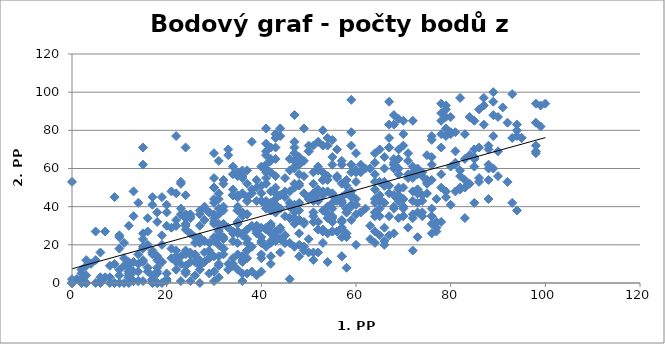
| Category | 2.PP |
|---|---|
| 43.0 | 65 |
| 37.0 | 43 |
| 27.0 | 7 |
| 33.0 | 70 |
| 41.0 | 19 |
| 55.0 | 34 |
| 82.0 | 50 |
| 48.0 | 52 |
| 19.0 | 11 |
| 68.0 | 88 |
| 8.0 | 3 |
| 24.0 | 16 |
| 48.0 | 57 |
| 74.0 | 37 |
| 50.0 | 72 |
| 58.0 | 24 |
| 61.0 | 37 |
| 57.0 | 14 |
| 62.0 | 60 |
| 43.0 | 41 |
| 54.0 | 40 |
| 48.0 | 66 |
| 40.0 | 13 |
| 35.0 | 38 |
| 76.0 | 75 |
| 66.0 | 20 |
| 69.0 | 86 |
| 21.0 | 29 |
| 90.0 | 69 |
| 73.0 | 42 |
| 87.0 | 93 |
| 23.0 | 14 |
| 68.0 | 60 |
| 11.0 | 9 |
| 46.0 | 2 |
| 42.0 | 38 |
| 54.0 | 34 |
| 48.0 | 33 |
| 88.0 | 72 |
| 17.0 | 41 |
| 30.0 | 36 |
| 72.0 | 85 |
| 55.0 | 27 |
| 2.0 | 0 |
| 2.0 | 5 |
| 48.0 | 33 |
| 76.0 | 31 |
| 41.0 | 69 |
| 85.0 | 85 |
| 42.0 | 39 |
| 74.0 | 43 |
| 54.0 | 48 |
| 72.0 | 17 |
| 31.0 | 27 |
| 50.0 | 69 |
| 89.0 | 60 |
| 20.0 | 2 |
| 10.0 | 24 |
| 84.0 | 87 |
| 91.0 | 92 |
| 76.0 | 35 |
| 53.0 | 72 |
| 37.0 | 43 |
| 35.0 | 46 |
| 47.0 | 52 |
| 28.0 | 39 |
| 35.0 | 27 |
| 76.0 | 62 |
| 8.0 | 0 |
| 19.0 | 25 |
| 68.0 | 40 |
| 58.0 | 47 |
| 28.0 | 33 |
| 27.0 | 30 |
| 84.0 | 67 |
| 40.0 | 29 |
| 26.0 | 15 |
| 79.0 | 81 |
| 78.0 | 89 |
| 42.0 | 64 |
| 73.0 | 49 |
| 66.0 | 53 |
| 25.0 | 11 |
| 9.0 | 45 |
| 24.0 | 17 |
| 95.0 | 76 |
| 52.0 | 47 |
| 14.0 | 15 |
| 30.0 | 1 |
| 18.0 | 5 |
| 58.0 | 51 |
| 42.0 | 71 |
| 0.0 | 0 |
| 42.0 | 26 |
| 89.0 | 95 |
| 26.0 | 15 |
| 70.0 | 85 |
| 19.0 | 11 |
| 34.0 | 49 |
| 53.0 | 54 |
| 42.0 | 30 |
| 63.0 | 60 |
| 54.0 | 36 |
| 5.0 | 27 |
| 98.0 | 68 |
| 86.0 | 91 |
| 49.0 | 19 |
| 52.0 | 49 |
| 42.0 | 38 |
| 24.0 | 15 |
| 5.0 | 0 |
| 79.0 | 93 |
| 65.0 | 46 |
| 30.0 | 22 |
| 35.0 | 58 |
| 34.0 | 10 |
| 21.0 | 18 |
| 69.0 | 60 |
| 82.0 | 59 |
| 70.0 | 50 |
| 86.0 | 53 |
| 67.0 | 71 |
| 71.0 | 55 |
| 88.0 | 62 |
| 31.0 | 3 |
| 29.0 | 13 |
| 15.0 | 1 |
| 26.0 | 21 |
| 20.0 | 1 |
| 31.0 | 24 |
| 43.0 | 76 |
| 24.0 | 46 |
| 53.0 | 27 |
| 36.0 | 1 |
| 35.0 | 27 |
| 78.0 | 78 |
| 55.0 | 75 |
| 25.0 | 1 |
| 17.0 | 1 |
| 41.0 | 59 |
| 81.0 | 79 |
| 0.0 | 53 |
| 55.0 | 27 |
| 59.0 | 40 |
| 68.0 | 46 |
| 37.0 | 5 |
| 64.0 | 63 |
| 41.0 | 67 |
| 37.0 | 45 |
| 17.0 | 17 |
| 65.0 | 39 |
| 48.0 | 42 |
| 59.0 | 33 |
| 29.0 | 16 |
| 43.0 | 37 |
| 67.0 | 47 |
| 30.0 | 14 |
| 47.0 | 38 |
| 30.0 | 55 |
| 32.0 | 38 |
| 21.0 | 13 |
| 94.0 | 83 |
| 74.0 | 58 |
| 37.0 | 17 |
| 48.0 | 20 |
| 51.0 | 47 |
| 31.0 | 10 |
| 57.0 | 29 |
| 37.0 | 13 |
| 30.0 | 44 |
| 71.0 | 29 |
| 43.0 | 27 |
| 35.0 | 45 |
| 7.0 | 3 |
| 36.0 | 25 |
| 41.0 | 39 |
| 24.0 | 31 |
| 51.0 | 16 |
| 79.0 | 77 |
| 55.0 | 35 |
| 47.0 | 71 |
| 39.0 | 30 |
| 2.0 | 2 |
| 68.0 | 63 |
| 32.0 | 18 |
| 29.0 | 17 |
| 6.0 | 3 |
| 57.0 | 33 |
| 32.0 | 31 |
| 47.0 | 34 |
| 11.0 | 21 |
| 3.0 | 0 |
| 31.0 | 39 |
| 31.0 | 64 |
| 86.0 | 55 |
| 17.0 | 2 |
| 53.0 | 80 |
| 42.0 | 58 |
| 19.0 | 45 |
| 65.0 | 70 |
| 90.0 | 87 |
| 60.0 | 68 |
| 10.0 | 18 |
| 37.0 | 23 |
| 50.0 | 45 |
| 32.0 | 18 |
| 32.0 | 24 |
| 12.0 | 0 |
| 81.0 | 48 |
| 12.0 | 3 |
| 47.0 | 61 |
| 73.0 | 47 |
| 12.0 | 10 |
| 60.0 | 36 |
| 64.0 | 37 |
| 66.0 | 29 |
| 47.0 | 37 |
| 10.0 | 7 |
| 88.0 | 60 |
| 51.0 | 43 |
| 6.0 | 1 |
| 45.0 | 48 |
| 99.0 | 82 |
| 67.0 | 35 |
| 22.0 | 14 |
| 88.0 | 54 |
| 50.0 | 69 |
| 28.0 | 16 |
| 41.0 | 52 |
| 57.0 | 64 |
| 58.0 | 37 |
| 83.0 | 50 |
| 78.0 | 85 |
| 30.0 | 50 |
| 29.0 | 37 |
| 34.0 | 22 |
| 16.0 | 20 |
| 15.0 | 26 |
| 37.0 | 36 |
| 65.0 | 25 |
| 61.0 | 62 |
| 35.0 | 40 |
| 51.0 | 72 |
| 15.0 | 19 |
| 63.0 | 23 |
| 2.0 | 1 |
| 12.0 | 3 |
| 25.0 | 26 |
| 6.0 | 0 |
| 36.0 | 12 |
| 11.0 | 0 |
| 88.0 | 44 |
| 35.0 | 45 |
| 51.0 | 12 |
| 26.0 | 4 |
| 0.0 | 0 |
| 17.0 | 15 |
| 41.0 | 39 |
| 54.0 | 72 |
| 74.0 | 56 |
| 15.0 | 18 |
| 38.0 | 6 |
| 65.0 | 53 |
| 25.0 | 15 |
| 36.0 | 26 |
| 13.0 | 35 |
| 45.0 | 45 |
| 55.0 | 62 |
| 27.0 | 12 |
| 51.0 | 45 |
| 68.0 | 83 |
| 46.0 | 21 |
| 51.0 | 32 |
| 0.0 | 2 |
| 73.0 | 60 |
| 12.0 | 10 |
| 72.0 | 61 |
| 43.0 | 23 |
| 12.0 | 6 |
| 77.0 | 29 |
| 29.0 | 37 |
| 30.0 | 24 |
| 27.0 | 0 |
| 31.0 | 47 |
| 48.0 | 26 |
| 42.0 | 14 |
| 43.0 | 71 |
| 68.0 | 65 |
| 43.0 | 78 |
| 17.0 | 45 |
| 34.0 | 46 |
| 24.0 | 6 |
| 76.0 | 39 |
| 30.0 | 68 |
| 15.0 | 11 |
| 27.0 | 9 |
| 38.0 | 19 |
| 73.0 | 49 |
| 57.0 | 45 |
| 36.0 | 55 |
| 66.0 | 22 |
| 59.0 | 46 |
| 69.0 | 46 |
| 17.0 | 0 |
| 25.0 | 36 |
| 70.0 | 44 |
| 46.0 | 34 |
| 30.0 | 34 |
| 48.0 | 33 |
| 31.0 | 14 |
| 20.0 | 30 |
| 42.0 | 65 |
| 88.0 | 70 |
| 59.0 | 41 |
| 12.0 | 30 |
| 46.0 | 34 |
| 22.0 | 14 |
| 49.0 | 32 |
| 42.0 | 10 |
| 22.0 | 13 |
| 31.0 | 9 |
| 53.0 | 38 |
| 69.0 | 43 |
| 18.0 | 14 |
| 18.0 | 6 |
| 44.0 | 39 |
| 75.0 | 53 |
| 35.0 | 7 |
| 41.0 | 58 |
| 44.0 | 16 |
| 35.0 | 31 |
| 44.0 | 29 |
| 62.0 | 39 |
| 76.0 | 54 |
| 57.0 | 24 |
| 48.0 | 14 |
| 69.0 | 57 |
| 60.0 | 58 |
| 53.0 | 46 |
| 42.0 | 48 |
| 24.0 | 9 |
| 73.0 | 37 |
| 50.0 | 23 |
| 27.0 | 36 |
| 93.0 | 42 |
| 71.0 | 57 |
| 43.0 | 47 |
| 3.0 | 9 |
| 40.0 | 43 |
| 69.0 | 49 |
| 41.0 | 41 |
| 78.0 | 71 |
| 72.0 | 36 |
| 36.0 | 35 |
| 39.0 | 50 |
| 11.0 | 13 |
| 46.0 | 42 |
| 38.0 | 74 |
| 56.0 | 43 |
| 10.0 | 25 |
| 18.0 | 12 |
| 29.0 | 21 |
| 78.0 | 57 |
| 51.0 | 58 |
| 28.0 | 11 |
| 16.0 | 6 |
| 72.0 | 55 |
| 43.0 | 27 |
| 61.0 | 37 |
| 54.0 | 40 |
| 73.0 | 57 |
| 84.0 | 52 |
| 56.0 | 56 |
| 22.0 | 11 |
| 34.0 | 46 |
| 55.0 | 39 |
| 17.0 | 2 |
| 15.0 | 71 |
| 67.0 | 25 |
| 54.0 | 26 |
| 38.0 | 47 |
| 20.0 | 37 |
| 33.0 | 10 |
| 85.0 | 65 |
| 87.0 | 83 |
| 43.0 | 22 |
| 37.0 | 17 |
| 93.0 | 99 |
| 41.0 | 73 |
| 73.0 | 59 |
| 39.0 | 54 |
| 75.0 | 47 |
| 60.0 | 59 |
| 56.0 | 44 |
| 49.0 | 47 |
| 46.0 | 40 |
| 14.0 | 1 |
| 67.0 | 76 |
| 9.0 | 0 |
| 37.0 | 36 |
| 32.0 | 15 |
| 13.0 | 1 |
| 12.0 | 4 |
| 77.0 | 44 |
| 56.0 | 70 |
| 3.0 | 4 |
| 24.0 | 34 |
| 36.0 | 58 |
| 40.0 | 6 |
| 89.0 | 77 |
| 55.0 | 66 |
| 77.0 | 32 |
| 72.0 | 58 |
| 49.0 | 81 |
| 90.0 | 56 |
| 52.0 | 16 |
| 44.0 | 81 |
| 34.0 | 57 |
| 41.0 | 62 |
| 20.0 | 5 |
| 16.0 | 34 |
| 54.0 | 56 |
| 12.0 | 11 |
| 54.0 | 54 |
| 23.0 | 1 |
| 6.0 | 16 |
| 67.0 | 95 |
| 73.0 | 47 |
| 80.0 | 79 |
| 22.0 | 77 |
| 76.0 | 35 |
| 22.0 | 12 |
| 36.0 | 14 |
| 44.0 | 23 |
| 36.0 | 47 |
| 40.0 | 21 |
| 77.0 | 27 |
| 18.0 | 0 |
| 43.0 | 37 |
| 35.0 | 38 |
| 52.0 | 59 |
| 78.0 | 94 |
| 12.0 | 5 |
| 55.0 | 47 |
| 72.0 | 34 |
| 48.0 | 51 |
| 14.0 | 42 |
| 57.0 | 52 |
| 70.0 | 40 |
| 47.0 | 19 |
| 25.0 | 35 |
| 80.0 | 41 |
| 98.0 | 72 |
| 70.0 | 40 |
| 32.0 | 40 |
| 22.0 | 17 |
| 46.0 | 48 |
| 32.0 | 23 |
| 42.0 | 38 |
| 33.0 | 67 |
| 32.0 | 54 |
| 15.0 | 62 |
| 37.0 | 59 |
| 100.0 | 94 |
| 39.0 | 43 |
| 89.0 | 100 |
| 58.0 | 26 |
| 69.0 | 65 |
| 36.0 | 14 |
| 82.0 | 56 |
| 53.0 | 21 |
| 58.0 | 39 |
| 22.0 | 33 |
| 47.0 | 88 |
| 56.0 | 27 |
| 71.0 | 68 |
| 8.0 | 9 |
| 49.0 | 31 |
| 51.0 | 37 |
| 64.0 | 42 |
| 22.0 | 30 |
| 35.0 | 15 |
| 3.0 | 0 |
| 46.0 | 40 |
| 47.0 | 50 |
| 57.0 | 14 |
| 48.0 | 38 |
| 68.0 | 46 |
| 63.0 | 30 |
| 66.0 | 60 |
| 26.0 | 24 |
| 70.0 | 35 |
| 68.0 | 62 |
| 81.0 | 62 |
| 31.0 | 28 |
| 23.0 | 36 |
| 22.0 | 47 |
| 43.0 | 50 |
| 59.0 | 62 |
| 39.0 | 28 |
| 70.0 | 39 |
| 78.0 | 50 |
| 60.0 | 44 |
| 94.0 | 80 |
| 54.0 | 76 |
| 43.0 | 44 |
| 19.0 | 0 |
| 24.0 | 6 |
| 18.0 | 8 |
| 25.0 | 26 |
| 45.0 | 25 |
| 35.0 | 26 |
| 43.0 | 25 |
| 98.0 | 84 |
| 37.0 | 28 |
| 68.0 | 62 |
| 36.0 | 11 |
| 58.0 | 54 |
| 18.0 | 14 |
| 59.0 | 79 |
| 39.0 | 4 |
| 29.0 | 5 |
| 81.0 | 63 |
| 4.0 | 10 |
| 70.0 | 72 |
| 7.0 | 27 |
| 34.0 | 61 |
| 55.0 | 32 |
| 64.0 | 37 |
| 42.0 | 38 |
| 75.0 | 54 |
| 41.0 | 60 |
| 25.0 | 34 |
| 44.0 | 39 |
| 28.0 | 22 |
| 49.0 | 19 |
| 76.0 | 66 |
| 72.0 | 43 |
| 59.0 | 96 |
| 60.0 | 20 |
| 92.0 | 84 |
| 0.0 | 0 |
| 13.0 | 6 |
| 16.0 | 8 |
| 52.0 | 61 |
| 47.0 | 31 |
| 57.0 | 62 |
| 40.0 | 43 |
| 53.0 | 28 |
| 39.0 | 26 |
| 48.0 | 62 |
| 32.0 | 52 |
| 85.0 | 66 |
| 60.0 | 53 |
| 24.0 | 5 |
| 75.0 | 67 |
| 86.0 | 71 |
| 24.0 | 30 |
| 52.0 | 43 |
| 15.0 | 12 |
| 40.0 | 51 |
| 27.0 | 38 |
| 49.0 | 64 |
| 1.0 | 2 |
| 85.0 | 70 |
| 33.0 | 7 |
| 69.0 | 50 |
| 18.0 | 0 |
| 53.0 | 58 |
| 19.0 | 20 |
| 30.0 | 32 |
| 92.0 | 53 |
| 57.0 | 42 |
| 53.0 | 54 |
| 74.0 | 35 |
| 79.0 | 45 |
| 47.0 | 74 |
| 34.0 | 26 |
| 93.0 | 76 |
| 24.0 | 36 |
| 87.0 | 97 |
| 64.0 | 53 |
| 14.0 | 6 |
| 46.0 | 65 |
| 75.0 | 52 |
| 66.0 | 66 |
| 66.0 | 42 |
| 64.0 | 44 |
| 40.0 | 22 |
| 40.0 | 15 |
| 82.0 | 49 |
| 85.0 | 42 |
| 20.0 | 41 |
| 79.0 | 48 |
| 76.0 | 77 |
| 66.0 | 51 |
| 10.0 | 0 |
| 41.0 | 43 |
| 52.0 | 32 |
| 80.0 | 87 |
| 83.0 | 54 |
| 40.0 | 47 |
| 58.0 | 37 |
| 52.0 | 28 |
| 64.0 | 57 |
| 47.0 | 41 |
| 70.0 | 35 |
| 31.0 | 36 |
| 57.0 | 28 |
| 34.0 | 46 |
| 83.0 | 34 |
| 45.0 | 55 |
| 43.0 | 56 |
| 31.0 | 31 |
| 35.0 | 58 |
| 68.0 | 26 |
| 52.0 | 74 |
| 22.0 | 7 |
| 73.0 | 47 |
| 57.0 | 43 |
| 41.0 | 29 |
| 79.0 | 91 |
| 51.0 | 52 |
| 67.0 | 51 |
| 45.0 | 21 |
| 28.0 | 40 |
| 26.0 | 11 |
| 37.0 | 52 |
| 42.0 | 31 |
| 36.0 | 5 |
| 17.0 | 2 |
| 76.0 | 26 |
| 80.0 | 61 |
| 57.0 | 42 |
| 65.0 | 43 |
| 25.0 | 16 |
| 52.0 | 28 |
| 95.0 | 76 |
| 41.0 | 55 |
| 42.0 | 22 |
| 66.0 | 53 |
| 12.0 | 6 |
| 18.0 | 32 |
| 41.0 | 28 |
| 51.0 | 35 |
| 98.0 | 94 |
| 14.0 | 1 |
| 64.0 | 35 |
| 99.0 | 93 |
| 3.0 | 12 |
| 98.0 | 69 |
| 2.0 | 7 |
| 26.0 | 14 |
| 69.0 | 70 |
| 24.0 | 28 |
| 45.0 | 35 |
| 30.0 | 50 |
| 64.0 | 27 |
| 27.0 | 21 |
| 13.0 | 48 |
| 34.0 | 27 |
| 67.0 | 71 |
| 68.0 | 39 |
| 23.0 | 39 |
| 37.0 | 21 |
| 55.0 | 42 |
| 94.0 | 38 |
| 42.0 | 42 |
| 47.0 | 68 |
| 81.0 | 69 |
| 39.0 | 30 |
| 65.0 | 35 |
| 69.0 | 34 |
| 47.0 | 64 |
| 38.0 | 30 |
| 44.0 | 46 |
| 60.0 | 41 |
| 79.0 | 87 |
| 65.0 | 44 |
| 14.0 | 10 |
| 39.0 | 27 |
| 33.0 | 29 |
| 43.0 | 41 |
| 21.0 | 48 |
| 78.0 | 32 |
| 18.0 | 37 |
| 35.0 | 56 |
| 22.0 | 30 |
| 31.0 | 44 |
| 23.0 | 53 |
| 54.0 | 11 |
| 5.0 | 12 |
| 49.0 | 56 |
| 30.0 | 42 |
| 66.0 | 51 |
| 72.0 | 48 |
| 30.0 | 31 |
| 64.0 | 49 |
| 23.0 | 52 |
| 57.0 | 32 |
| 64.0 | 21 |
| 83.0 | 78 |
| 70.0 | 78 |
| 44.0 | 77 |
| 73.0 | 24 |
| 17.0 | 16 |
| 45.0 | 21 |
| 38.0 | 49 |
| 58.0 | 8 |
| 61.0 | 58 |
| 59.0 | 62 |
| 13.0 | 11 |
| 40.0 | 61 |
| 35.0 | 21 |
| 59.0 | 48 |
| 59.0 | 72 |
| 36.0 | 59 |
| 67.0 | 83 |
| 23.0 | 10 |
| 64.0 | 68 |
| 16.0 | 27 |
| 35.0 | 32 |
| 17.0 | 4 |
| 31.0 | 25 |
| 40.0 | 24 |
| 36.0 | 56 |
| 50.0 | 16 |
| 10.0 | 4 |
| 50.0 | 44 |
| 34.0 | 13 |
| 12.0 | 8 |
| 47.0 | 60 |
| 34.0 | 9 |
| 85.0 | 61 |
| 74.0 | 46 |
| 83.0 | 65 |
| 30.0 | 6 |
| 58.0 | 39 |
| 45.0 | 25 |
| 42.0 | 21 |
| 56.0 | 55 |
| 31.0 | 20 |
| 59.0 | 45 |
| 69.0 | 44 |
| 27.0 | 24 |
| 46.0 | 59 |
| 82.0 | 97 |
| 13.0 | 1 |
| 80.0 | 78 |
| 71.0 | 64 |
| 9.0 | 10 |
| 49.0 | 17 |
| 24.0 | 71 |
| 55.0 | 46 |
| 53.0 | 48 |
| 94.0 | 77 |
| 41.0 | 81 |
| 15.0 | 23 |
| 36.0 | 37 |
| 59.0 | 58 |
| 89.0 | 88 |
| 44.0 | 28 |